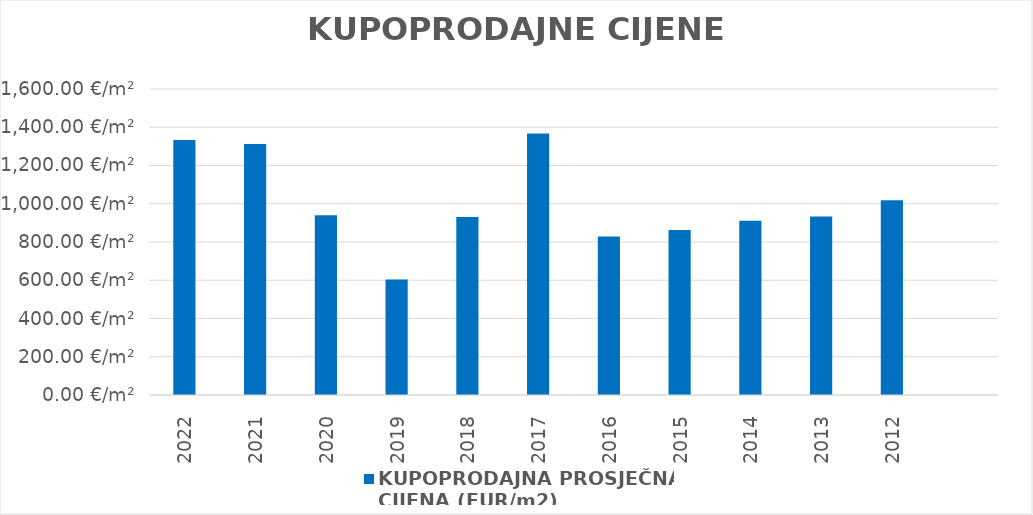
| Category | KUPOPRODAJNA PROSJEČNA 
CIJENA (EUR/m2) |
|---|---|
| 2022 | 1903-08-25 08:20:36 |
| 2021 | 1903-08-04 21:33:28 |
| 2020 | 1902-07-28 00:13:15 |
| 2019 | 1901-08-25 07:00:12 |
| 2018 | 1902-07-19 07:07:44 |
| 2017 | 1903-09-27 20:40:26 |
| 2016 | 1902-04-07 09:50:50 |
| 2015 | 1902-05-12 02:57:36 |
| 2014 | 1902-06-29 09:56:53 |
| 2013 | 1902-07-21 18:43:01 |
| 2012 | 1902-10-14 06:20:56 |